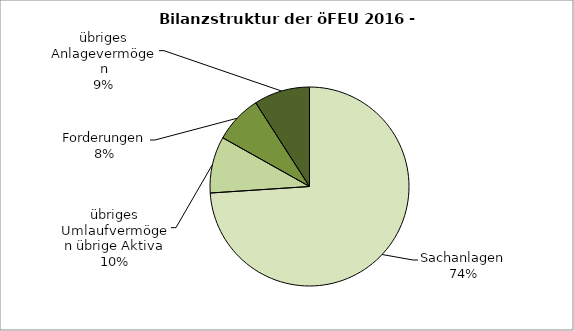
| Category | Series 0 |
|---|---|
| Sachanlagen | 73.993 |
| übriges Umlaufvermögen übrige Aktiva | 9.198 |
| Forderungen | 7.772 |
| übriges Anlagevermögen | 9.092 |